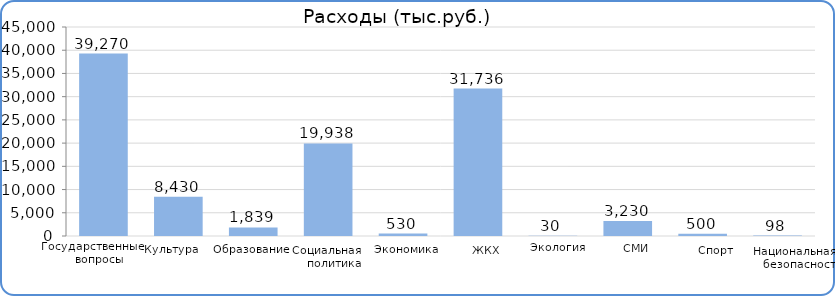
| Category | Расходы |
|---|---|
| Государственные вопросы | 39270400 |
| Культура | 8429700 |
| Образование | 1839000 |
| Социальная политика | 19937800 |
| Экономика | 530000 |
| ЖКХ | 31735800 |
| Экология | 30000 |
| СМИ | 3230000 |
| Спорт | 500000 |
| Нац.безопасность | 98000 |